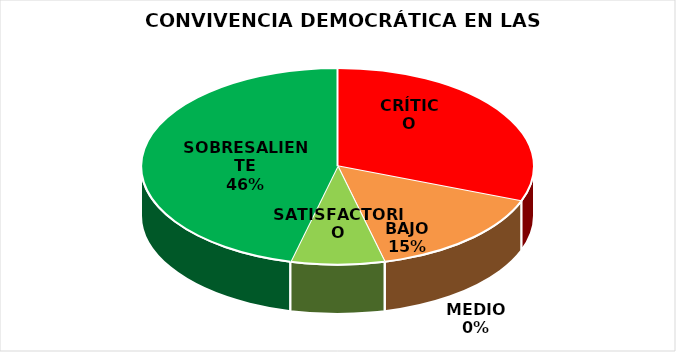
| Category | Series 0 |
|---|---|
| CRÍTICO | 4 |
| BAJO | 2 |
| MEDIO | 0 |
| SATISFACTORIO | 1 |
| SOBRESALIENTE | 6 |